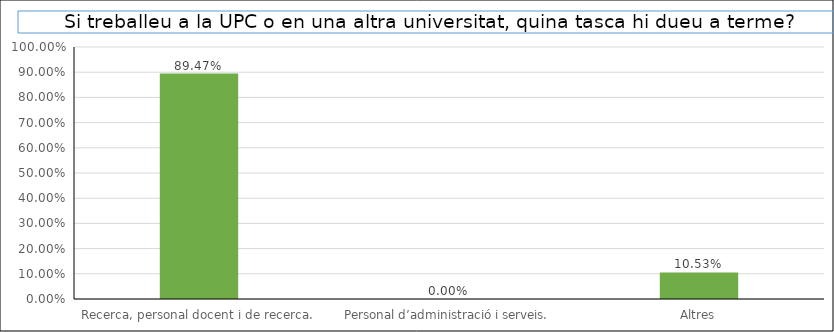
| Category | Series 0 |
|---|---|
| Recerca, personal docent i de recerca. | 0.895 |
| Personal d’administració i serveis. | 0 |
| Altres | 0.105 |